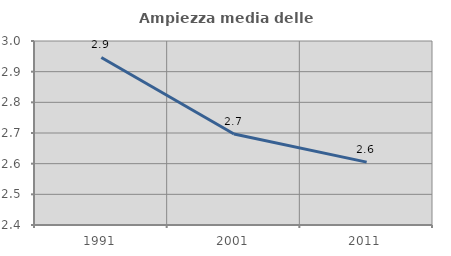
| Category | Ampiezza media delle famiglie |
|---|---|
| 1991.0 | 2.946 |
| 2001.0 | 2.697 |
| 2011.0 | 2.605 |